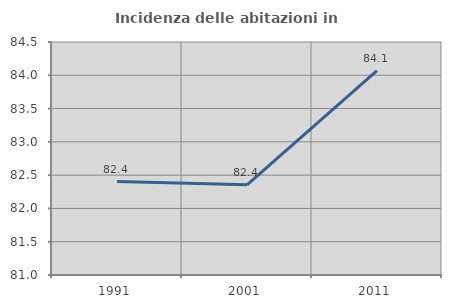
| Category | Incidenza delle abitazioni in proprietà  |
|---|---|
| 1991.0 | 82.404 |
| 2001.0 | 82.356 |
| 2011.0 | 84.069 |